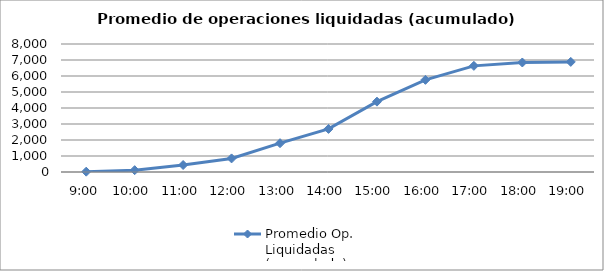
| Category | Promedio Op.
Liquidadas 
(acumulado) |
|---|---|
| 0.375 | 20.421 |
| 0.4166666666666667 | 115.053 |
| 0.4583333333333333 | 437.316 |
| 0.5 | 849.579 |
| 0.5416666666666666 | 1800.632 |
| 0.583333333333333 | 2692.368 |
| 0.625 | 4397.421 |
| 0.666666666666667 | 5759.263 |
| 0.708333333333333 | 6633.421 |
| 0.75 | 6844.211 |
| 0.791666666666667 | 6881.579 |